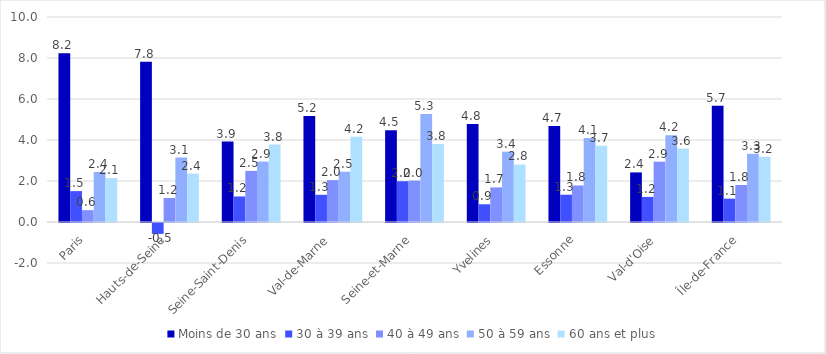
| Category | Moins de 30 ans | 30 à 39 ans | 40 à 49 ans | 50 à 59 ans | 60 ans et plus |
|---|---|---|---|---|---|
| Paris | 8.233 | 1.507 | 0.58 | 2.439 | 2.141 |
| Hauts-de-Seine | 7.818 | -0.532 | 1.171 | 3.142 | 2.359 |
| Seine-Saint-Denis | 3.923 | 1.245 | 2.493 | 2.948 | 3.778 |
| Val-de-Marne | 5.176 | 1.327 | 2.043 | 2.455 | 4.154 |
| Seine-et-Marne | 4.475 | 1.989 | 2.02 | 5.263 | 3.801 |
| Yvelines | 4.776 | 0.865 | 1.688 | 3.432 | 2.805 |
| Essonne | 4.683 | 1.332 | 1.782 | 4.092 | 3.717 |
| Val-d'Oise | 2.418 | 1.224 | 2.942 | 4.234 | 3.583 |
| Île-de-France | 5.671 | 1.139 | 1.806 | 3.329 | 3.179 |